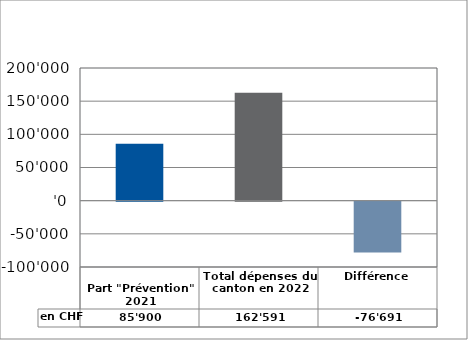
| Category | en CHF |
|---|---|
| 
Part "Prévention" 2021

 | 85900 |
| Total dépenses du canton en 2022 | 162591 |
| Différence | -76691 |